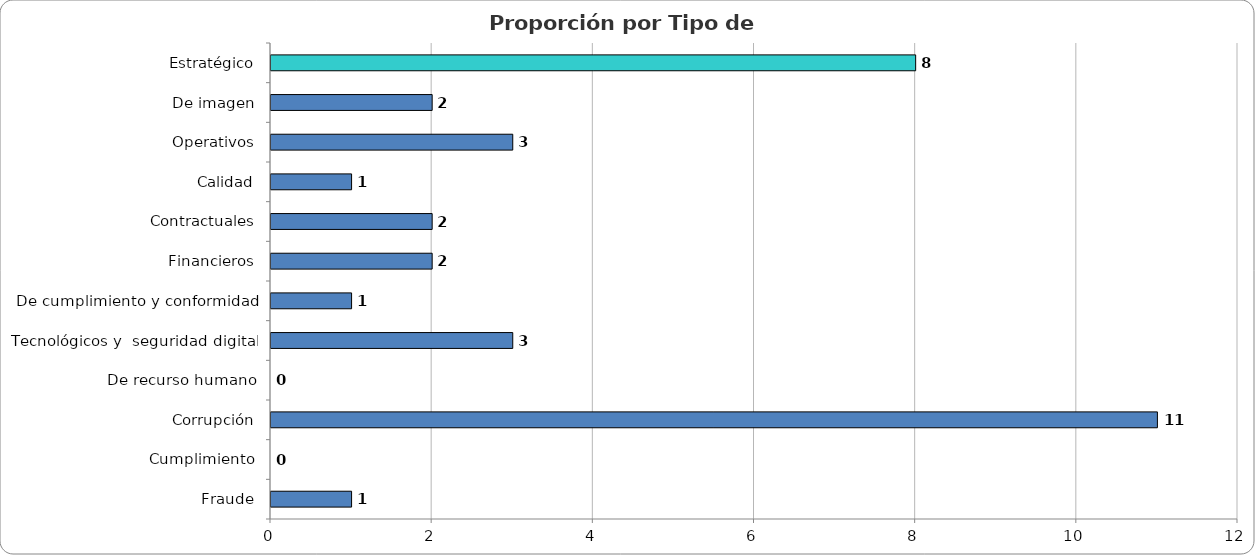
| Category | Series 0 |
|---|---|
| Estratégico | 8 |
| De imagen | 2 |
| Operativos | 3 |
| Calidad | 1 |
| Contractuales | 2 |
| Financieros | 2 |
| De cumplimiento y conformidad | 1 |
| Tecnológicos y  seguridad digital | 3 |
| De recurso humano | 0 |
| Corrupción | 11 |
| Cumplimiento | 0 |
| Fraude | 1 |